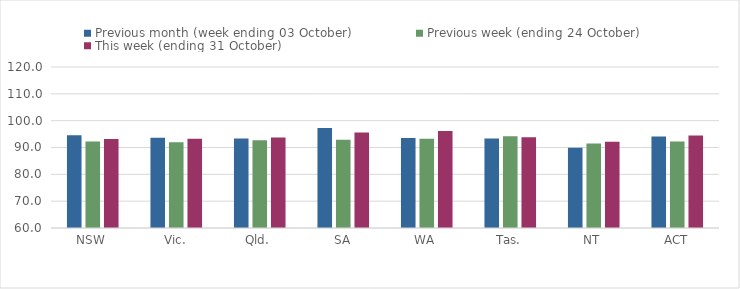
| Category | Previous month (week ending 03 October) | Previous week (ending 24 October) | This week (ending 31 October) |
|---|---|---|---|
| NSW | 94.53 | 92.24 | 93.16 |
| Vic. | 93.66 | 91.97 | 93.27 |
| Qld. | 93.4 | 92.74 | 93.69 |
| SA | 97.27 | 92.87 | 95.61 |
| WA | 93.51 | 93.28 | 96.14 |
| Tas. | 93.31 | 94.16 | 93.86 |
| NT | 89.95 | 91.53 | 92.13 |
| ACT | 94.07 | 92.28 | 94.44 |